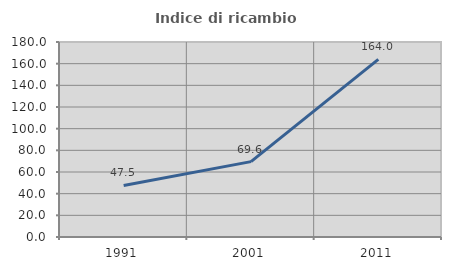
| Category | Indice di ricambio occupazionale  |
|---|---|
| 1991.0 | 47.541 |
| 2001.0 | 69.565 |
| 2011.0 | 164 |